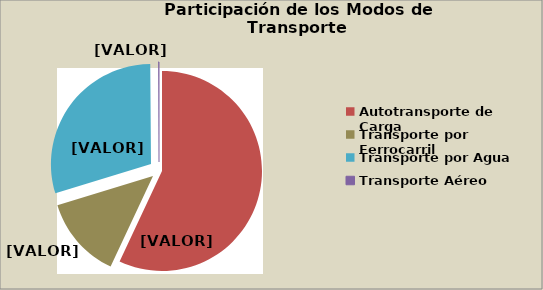
| Category | Series 0 |
|---|---|
| Autotransporte de Carga | 56.999 |
| Transporte por Ferrocarril | 13.3 |
| Transporte por Agua | 29.631 |
| Transporte Aéreo | 0.121 |